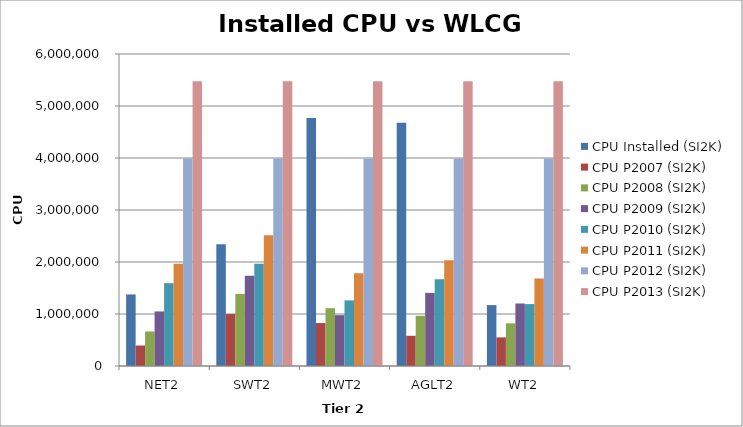
| Category | CPU Installed (SI2K) | CPU P2007 (SI2K) | CPU P2008 (SI2K) | CPU P2009 (SI2K) | CPU P2010 (SI2K) | CPU P2011 (SI2K) | CPU P2012 (SI2K) | CPU P2013 (SI2K) |
|---|---|---|---|---|---|---|---|---|
| NET2 | 1375816 | 394000 | 665000 | 1049000 | 1592000 | 1966000 | 3989600 | 5474000 |
| SWT2 | 2341916 | 998000 | 1386000 | 1734000 | 1966000 | 2514000 | 3989600 | 5474000 |
| MWT2 | 4770976 | 826000 | 1112000 | 978000 | 1262000 | 1785000 | 3989600 | 5474000 |
| AGLT2 | 4677868 | 581000 | 965000 | 1406000 | 1670000 | 2032000 | 3989600 | 5474000 |
| WT2 | 1171567.764 | 550000 | 820000 | 1202000 | 1191000 | 1685000 | 3989600 | 5474000 |